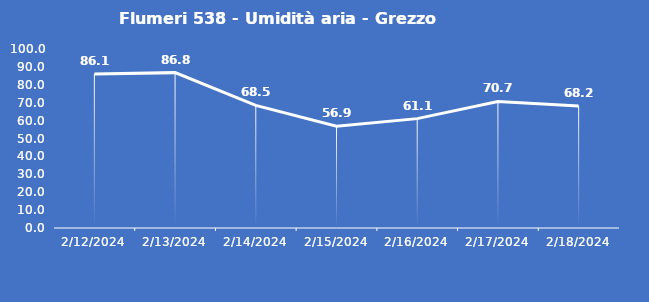
| Category | Flumeri 538 - Umidità aria - Grezzo (%) |
|---|---|
| 2/12/24 | 86.1 |
| 2/13/24 | 86.8 |
| 2/14/24 | 68.5 |
| 2/15/24 | 56.9 |
| 2/16/24 | 61.1 |
| 2/17/24 | 70.7 |
| 2/18/24 | 68.2 |